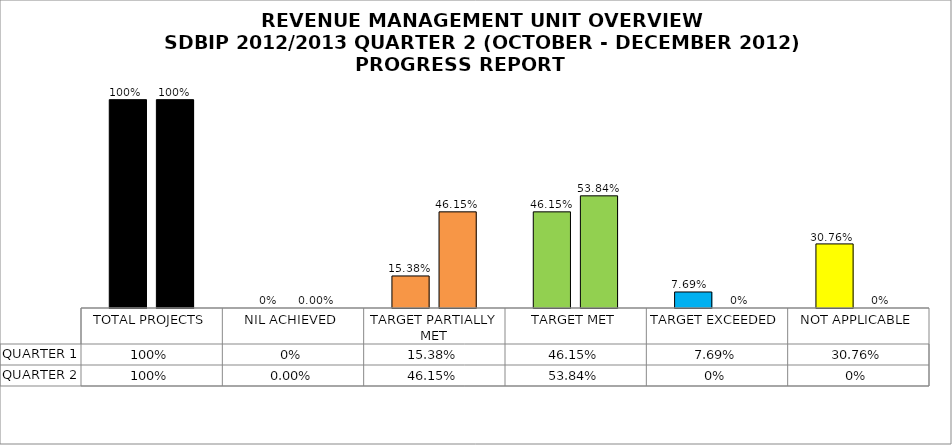
| Category | QUARTER 1 | QUARTER 2 |
|---|---|---|
| TOTAL PROJECTS | 1 | 1 |
| NIL ACHIEVED | 0 | 0 |
| TARGET PARTIALLY MET | 0.154 | 0.462 |
| TARGET MET | 0.462 | 0.538 |
| TARGET EXCEEDED | 0.077 | 0 |
| NOT APPLICABLE | 0.308 | 0 |